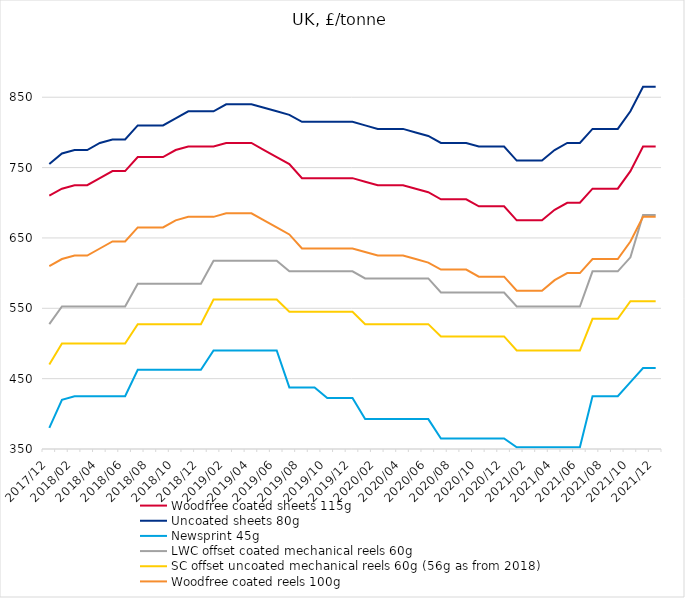
| Category | Woodfree coated sheets 115g  | Uncoated sheets 80g | Newsprint 45g | LWC offset coated mechanical reels 60g | SC offset uncoated mechanical reels 60g (56g as from 2018) | Woodfree coated reels 100g |
|---|---|---|---|---|---|---|
| 2017/12 | 710 | 755 | 380 | 527.5 | 470 | 610 |
| 2018/01 | 720 | 770 | 420 | 552.5 | 500 | 620 |
| 2018/02 | 725 | 775 | 425 | 552.5 | 500 | 625 |
| 2018/03 | 725 | 775 | 425 | 552.5 | 500 | 625 |
| 2018/04 | 735 | 785 | 425 | 552.5 | 500 | 635 |
| 2018/05 | 745 | 790 | 425 | 552.5 | 500 | 645 |
| 2018/06 | 745 | 790 | 425 | 552.5 | 500 | 645 |
| 2018/07 | 765 | 810 | 462.5 | 585 | 527.5 | 665 |
| 2018/08 | 765 | 810 | 462.5 | 585 | 527.5 | 665 |
| 2018/09 | 765 | 810 | 462.5 | 585 | 527.5 | 665 |
| 2018/10 | 775 | 820 | 462.5 | 585 | 527.5 | 675 |
| 2018/11 | 780 | 830 | 462.5 | 585 | 527.5 | 680 |
| 2018/12 | 780 | 830 | 462.5 | 585 | 527.5 | 680 |
| 2019/01 | 780 | 830 | 490 | 617.5 | 562.5 | 680 |
| 2019/02 | 785 | 840 | 490 | 617.5 | 562.5 | 685 |
| 2019/03 | 785 | 840 | 490 | 617.5 | 562.5 | 685 |
| 2019/04 | 785 | 840 | 490 | 617.5 | 562.5 | 685 |
| 2019/05 | 775 | 835 | 490 | 617.5 | 562.5 | 675 |
| 2019/06 | 765 | 830 | 490 | 617.5 | 562.5 | 665 |
| 2019/07 | 755 | 825 | 437.5 | 602.5 | 545 | 655 |
| 2019/08 | 735 | 815 | 437.5 | 602.5 | 545 | 635 |
| 2019/09 | 735 | 815 | 437.5 | 602.5 | 545 | 635 |
| 2019/10 | 735 | 815 | 422.5 | 602.5 | 545 | 635 |
| 2019/11 | 735 | 815 | 422.5 | 602.5 | 545 | 635 |
| 2019/12 | 735 | 815 | 422.5 | 602.5 | 545 | 635 |
| 2020/01 | 730 | 810 | 392.5 | 592.5 | 527.5 | 630 |
| 2020/02 | 725 | 805 | 392.5 | 592.5 | 527.5 | 625 |
| 2020/03 | 725 | 805 | 392.5 | 592.5 | 527.5 | 625 |
| 2020/04 | 725 | 805 | 392.5 | 592.5 | 527.5 | 625 |
| 2020/05 | 720 | 800 | 392.5 | 592.5 | 527.5 | 620 |
| 2020/06 | 715 | 795 | 392.5 | 592.5 | 527.5 | 615 |
| 2020/07 | 705 | 785 | 365 | 572.5 | 510 | 605 |
| 2020/08 | 705 | 785 | 365 | 572.5 | 510 | 605 |
| 2020/09 | 705 | 785 | 365 | 572.5 | 510 | 605 |
| 2020/10 | 695 | 780 | 365 | 572.5 | 510 | 595 |
| 2020/11 | 695 | 780 | 365 | 572.5 | 510 | 595 |
| 2020/12 | 695 | 780 | 365 | 572.5 | 510 | 595 |
| 2021/01 | 675 | 760 | 352.5 | 552.5 | 490 | 575 |
| 2021/02 | 675 | 760 | 352.5 | 552.5 | 490 | 575 |
| 2021/03 | 675 | 760 | 352.5 | 552.5 | 490 | 575 |
| 2021/04 | 690 | 775 | 352.5 | 552.5 | 490 | 590 |
| 2021/05 | 700 | 785 | 352.5 | 552.5 | 490 | 600 |
| 2021/06 | 700 | 785 | 352.5 | 552.5 | 490 | 600 |
| 2021/07 | 720 | 805 | 425 | 602.5 | 535 | 620 |
| 2021/08 | 720 | 805 | 425 | 602.5 | 535 | 620 |
| 2021/09 | 720 | 805 | 425 | 602.5 | 535 | 620 |
| 2021/10 | 745 | 830 | 445 | 622.5 | 560 | 645 |
| 2021/11 | 780 | 865 | 465 | 682.5 | 560 | 680 |
| 2021/12 | 780 | 865 | 465 | 682.5 | 560 | 680 |